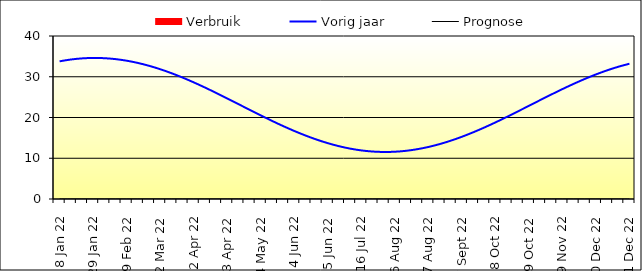
| Category | Verbruik |
|---|---|
| 2022-01-08 | 0 |
| 2022-01-15 | 0 |
| 2022-01-22 | 0 |
| 2022-01-29 | 0 |
| 2022-02-05 | 0 |
| 2022-02-12 | 0 |
| 2022-02-19 | 0 |
| 2022-02-26 | 0 |
| 2022-03-05 | 0 |
| 2022-03-12 | 0 |
| 2022-03-19 | 0 |
| 2022-03-26 | 0 |
| 2022-04-02 | 0 |
| 2022-04-09 | 0 |
| 2022-04-16 | 0 |
| 2022-04-23 | 0 |
| 2022-04-30 | 0 |
| 2022-05-07 | 0 |
| 2022-05-14 | 0 |
| 2022-05-21 | 0 |
| 2022-05-28 | 0 |
| 2022-06-04 | 0 |
| 2022-06-11 | 0 |
| 2022-06-18 | 0 |
| 2022-06-25 | 0 |
| 2022-07-02 | 0 |
| 2022-07-09 | 0 |
| 2022-07-16 | 0 |
| 2022-07-23 | 0 |
| 2022-07-30 | 0 |
| 2022-08-06 | 0 |
| 2022-08-13 | 0 |
| 2022-08-20 | 0 |
| 2022-08-27 | 0 |
| 2022-09-03 | 0 |
| 2022-09-10 | 0 |
| 2022-09-17 | 0 |
| 2022-09-24 | 0 |
| 2022-10-01 | 0 |
| 2022-10-08 | 0 |
| 2022-10-15 | 0 |
| 2022-10-22 | 0 |
| 2022-10-29 | 0 |
| 2022-11-05 | 0 |
| 2022-11-12 | 0 |
| 2022-11-19 | 0 |
| 2022-11-26 | 0 |
| 2022-12-03 | 0 |
| 2022-12-10 | 0 |
| 2022-12-17 | 0 |
| 2022-12-24 | 0 |
| 2022-12-31 | 0 |